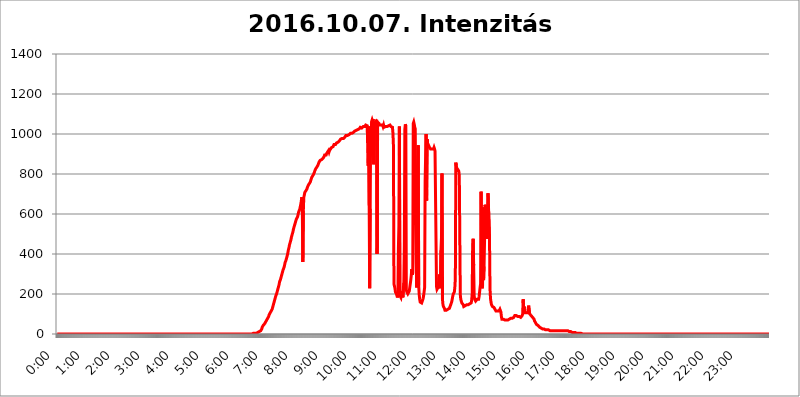
| Category | 2016.10.07. Intenzitás [W/m^2] |
|---|---|
| 0.0 | 0 |
| 0.0006944444444444445 | 0 |
| 0.001388888888888889 | 0 |
| 0.0020833333333333333 | 0 |
| 0.002777777777777778 | 0 |
| 0.003472222222222222 | 0 |
| 0.004166666666666667 | 0 |
| 0.004861111111111111 | 0 |
| 0.005555555555555556 | 0 |
| 0.0062499999999999995 | 0 |
| 0.006944444444444444 | 0 |
| 0.007638888888888889 | 0 |
| 0.008333333333333333 | 0 |
| 0.009027777777777779 | 0 |
| 0.009722222222222222 | 0 |
| 0.010416666666666666 | 0 |
| 0.011111111111111112 | 0 |
| 0.011805555555555555 | 0 |
| 0.012499999999999999 | 0 |
| 0.013194444444444444 | 0 |
| 0.013888888888888888 | 0 |
| 0.014583333333333332 | 0 |
| 0.015277777777777777 | 0 |
| 0.015972222222222224 | 0 |
| 0.016666666666666666 | 0 |
| 0.017361111111111112 | 0 |
| 0.018055555555555557 | 0 |
| 0.01875 | 0 |
| 0.019444444444444445 | 0 |
| 0.02013888888888889 | 0 |
| 0.020833333333333332 | 0 |
| 0.02152777777777778 | 0 |
| 0.022222222222222223 | 0 |
| 0.02291666666666667 | 0 |
| 0.02361111111111111 | 0 |
| 0.024305555555555556 | 0 |
| 0.024999999999999998 | 0 |
| 0.025694444444444447 | 0 |
| 0.02638888888888889 | 0 |
| 0.027083333333333334 | 0 |
| 0.027777777777777776 | 0 |
| 0.02847222222222222 | 0 |
| 0.029166666666666664 | 0 |
| 0.029861111111111113 | 0 |
| 0.030555555555555555 | 0 |
| 0.03125 | 0 |
| 0.03194444444444445 | 0 |
| 0.03263888888888889 | 0 |
| 0.03333333333333333 | 0 |
| 0.034027777777777775 | 0 |
| 0.034722222222222224 | 0 |
| 0.035416666666666666 | 0 |
| 0.036111111111111115 | 0 |
| 0.03680555555555556 | 0 |
| 0.0375 | 0 |
| 0.03819444444444444 | 0 |
| 0.03888888888888889 | 0 |
| 0.03958333333333333 | 0 |
| 0.04027777777777778 | 0 |
| 0.04097222222222222 | 0 |
| 0.041666666666666664 | 0 |
| 0.042361111111111106 | 0 |
| 0.04305555555555556 | 0 |
| 0.043750000000000004 | 0 |
| 0.044444444444444446 | 0 |
| 0.04513888888888889 | 0 |
| 0.04583333333333334 | 0 |
| 0.04652777777777778 | 0 |
| 0.04722222222222222 | 0 |
| 0.04791666666666666 | 0 |
| 0.04861111111111111 | 0 |
| 0.049305555555555554 | 0 |
| 0.049999999999999996 | 0 |
| 0.05069444444444445 | 0 |
| 0.051388888888888894 | 0 |
| 0.052083333333333336 | 0 |
| 0.05277777777777778 | 0 |
| 0.05347222222222222 | 0 |
| 0.05416666666666667 | 0 |
| 0.05486111111111111 | 0 |
| 0.05555555555555555 | 0 |
| 0.05625 | 0 |
| 0.05694444444444444 | 0 |
| 0.057638888888888885 | 0 |
| 0.05833333333333333 | 0 |
| 0.05902777777777778 | 0 |
| 0.059722222222222225 | 0 |
| 0.06041666666666667 | 0 |
| 0.061111111111111116 | 0 |
| 0.06180555555555556 | 0 |
| 0.0625 | 0 |
| 0.06319444444444444 | 0 |
| 0.06388888888888888 | 0 |
| 0.06458333333333334 | 0 |
| 0.06527777777777778 | 0 |
| 0.06597222222222222 | 0 |
| 0.06666666666666667 | 0 |
| 0.06736111111111111 | 0 |
| 0.06805555555555555 | 0 |
| 0.06874999999999999 | 0 |
| 0.06944444444444443 | 0 |
| 0.07013888888888889 | 0 |
| 0.07083333333333333 | 0 |
| 0.07152777777777779 | 0 |
| 0.07222222222222223 | 0 |
| 0.07291666666666667 | 0 |
| 0.07361111111111111 | 0 |
| 0.07430555555555556 | 0 |
| 0.075 | 0 |
| 0.07569444444444444 | 0 |
| 0.0763888888888889 | 0 |
| 0.07708333333333334 | 0 |
| 0.07777777777777778 | 0 |
| 0.07847222222222222 | 0 |
| 0.07916666666666666 | 0 |
| 0.0798611111111111 | 0 |
| 0.08055555555555556 | 0 |
| 0.08125 | 0 |
| 0.08194444444444444 | 0 |
| 0.08263888888888889 | 0 |
| 0.08333333333333333 | 0 |
| 0.08402777777777777 | 0 |
| 0.08472222222222221 | 0 |
| 0.08541666666666665 | 0 |
| 0.08611111111111112 | 0 |
| 0.08680555555555557 | 0 |
| 0.08750000000000001 | 0 |
| 0.08819444444444445 | 0 |
| 0.08888888888888889 | 0 |
| 0.08958333333333333 | 0 |
| 0.09027777777777778 | 0 |
| 0.09097222222222222 | 0 |
| 0.09166666666666667 | 0 |
| 0.09236111111111112 | 0 |
| 0.09305555555555556 | 0 |
| 0.09375 | 0 |
| 0.09444444444444444 | 0 |
| 0.09513888888888888 | 0 |
| 0.09583333333333333 | 0 |
| 0.09652777777777777 | 0 |
| 0.09722222222222222 | 0 |
| 0.09791666666666667 | 0 |
| 0.09861111111111111 | 0 |
| 0.09930555555555555 | 0 |
| 0.09999999999999999 | 0 |
| 0.10069444444444443 | 0 |
| 0.1013888888888889 | 0 |
| 0.10208333333333335 | 0 |
| 0.10277777777777779 | 0 |
| 0.10347222222222223 | 0 |
| 0.10416666666666667 | 0 |
| 0.10486111111111111 | 0 |
| 0.10555555555555556 | 0 |
| 0.10625 | 0 |
| 0.10694444444444444 | 0 |
| 0.1076388888888889 | 0 |
| 0.10833333333333334 | 0 |
| 0.10902777777777778 | 0 |
| 0.10972222222222222 | 0 |
| 0.1111111111111111 | 0 |
| 0.11180555555555556 | 0 |
| 0.11180555555555556 | 0 |
| 0.1125 | 0 |
| 0.11319444444444444 | 0 |
| 0.11388888888888889 | 0 |
| 0.11458333333333333 | 0 |
| 0.11527777777777777 | 0 |
| 0.11597222222222221 | 0 |
| 0.11666666666666665 | 0 |
| 0.1173611111111111 | 0 |
| 0.11805555555555557 | 0 |
| 0.11944444444444445 | 0 |
| 0.12013888888888889 | 0 |
| 0.12083333333333333 | 0 |
| 0.12152777777777778 | 0 |
| 0.12222222222222223 | 0 |
| 0.12291666666666667 | 0 |
| 0.12291666666666667 | 0 |
| 0.12361111111111112 | 0 |
| 0.12430555555555556 | 0 |
| 0.125 | 0 |
| 0.12569444444444444 | 0 |
| 0.12638888888888888 | 0 |
| 0.12708333333333333 | 0 |
| 0.16875 | 0 |
| 0.12847222222222224 | 0 |
| 0.12916666666666668 | 0 |
| 0.12986111111111112 | 0 |
| 0.13055555555555556 | 0 |
| 0.13125 | 0 |
| 0.13194444444444445 | 0 |
| 0.1326388888888889 | 0 |
| 0.13333333333333333 | 0 |
| 0.13402777777777777 | 0 |
| 0.13402777777777777 | 0 |
| 0.13472222222222222 | 0 |
| 0.13541666666666666 | 0 |
| 0.1361111111111111 | 0 |
| 0.13749999999999998 | 0 |
| 0.13819444444444443 | 0 |
| 0.1388888888888889 | 0 |
| 0.13958333333333334 | 0 |
| 0.14027777777777778 | 0 |
| 0.14097222222222222 | 0 |
| 0.14166666666666666 | 0 |
| 0.1423611111111111 | 0 |
| 0.14305555555555557 | 0 |
| 0.14375000000000002 | 0 |
| 0.14444444444444446 | 0 |
| 0.1451388888888889 | 0 |
| 0.1451388888888889 | 0 |
| 0.14652777777777778 | 0 |
| 0.14722222222222223 | 0 |
| 0.14791666666666667 | 0 |
| 0.1486111111111111 | 0 |
| 0.14930555555555555 | 0 |
| 0.15 | 0 |
| 0.15069444444444444 | 0 |
| 0.15138888888888888 | 0 |
| 0.15208333333333332 | 0 |
| 0.15277777777777776 | 0 |
| 0.15347222222222223 | 0 |
| 0.15416666666666667 | 0 |
| 0.15486111111111112 | 0 |
| 0.15555555555555556 | 0 |
| 0.15625 | 0 |
| 0.15694444444444444 | 0 |
| 0.15763888888888888 | 0 |
| 0.15833333333333333 | 0 |
| 0.15902777777777777 | 0 |
| 0.15972222222222224 | 0 |
| 0.16041666666666668 | 0 |
| 0.16111111111111112 | 0 |
| 0.16180555555555556 | 0 |
| 0.1625 | 0 |
| 0.16319444444444445 | 0 |
| 0.1638888888888889 | 0 |
| 0.16458333333333333 | 0 |
| 0.16527777777777777 | 0 |
| 0.16597222222222222 | 0 |
| 0.16666666666666666 | 0 |
| 0.1673611111111111 | 0 |
| 0.16805555555555554 | 0 |
| 0.16874999999999998 | 0 |
| 0.16944444444444443 | 0 |
| 0.17013888888888887 | 0 |
| 0.1708333333333333 | 0 |
| 0.17152777777777775 | 0 |
| 0.17222222222222225 | 0 |
| 0.1729166666666667 | 0 |
| 0.17361111111111113 | 0 |
| 0.17430555555555557 | 0 |
| 0.17500000000000002 | 0 |
| 0.17569444444444446 | 0 |
| 0.1763888888888889 | 0 |
| 0.17708333333333334 | 0 |
| 0.17777777777777778 | 0 |
| 0.17847222222222223 | 0 |
| 0.17916666666666667 | 0 |
| 0.1798611111111111 | 0 |
| 0.18055555555555555 | 0 |
| 0.18125 | 0 |
| 0.18194444444444444 | 0 |
| 0.1826388888888889 | 0 |
| 0.18333333333333335 | 0 |
| 0.1840277777777778 | 0 |
| 0.18472222222222223 | 0 |
| 0.18541666666666667 | 0 |
| 0.18611111111111112 | 0 |
| 0.18680555555555556 | 0 |
| 0.1875 | 0 |
| 0.18819444444444444 | 0 |
| 0.18888888888888888 | 0 |
| 0.18958333333333333 | 0 |
| 0.19027777777777777 | 0 |
| 0.1909722222222222 | 0 |
| 0.19166666666666665 | 0 |
| 0.19236111111111112 | 0 |
| 0.19305555555555554 | 0 |
| 0.19375 | 0 |
| 0.19444444444444445 | 0 |
| 0.1951388888888889 | 0 |
| 0.19583333333333333 | 0 |
| 0.19652777777777777 | 0 |
| 0.19722222222222222 | 0 |
| 0.19791666666666666 | 0 |
| 0.1986111111111111 | 0 |
| 0.19930555555555554 | 0 |
| 0.19999999999999998 | 0 |
| 0.20069444444444443 | 0 |
| 0.20138888888888887 | 0 |
| 0.2020833333333333 | 0 |
| 0.2027777777777778 | 0 |
| 0.2034722222222222 | 0 |
| 0.2041666666666667 | 0 |
| 0.20486111111111113 | 0 |
| 0.20555555555555557 | 0 |
| 0.20625000000000002 | 0 |
| 0.20694444444444446 | 0 |
| 0.2076388888888889 | 0 |
| 0.20833333333333334 | 0 |
| 0.20902777777777778 | 0 |
| 0.20972222222222223 | 0 |
| 0.21041666666666667 | 0 |
| 0.2111111111111111 | 0 |
| 0.21180555555555555 | 0 |
| 0.2125 | 0 |
| 0.21319444444444444 | 0 |
| 0.2138888888888889 | 0 |
| 0.21458333333333335 | 0 |
| 0.2152777777777778 | 0 |
| 0.21597222222222223 | 0 |
| 0.21666666666666667 | 0 |
| 0.21736111111111112 | 0 |
| 0.21805555555555556 | 0 |
| 0.21875 | 0 |
| 0.21944444444444444 | 0 |
| 0.22013888888888888 | 0 |
| 0.22083333333333333 | 0 |
| 0.22152777777777777 | 0 |
| 0.2222222222222222 | 0 |
| 0.22291666666666665 | 0 |
| 0.2236111111111111 | 0 |
| 0.22430555555555556 | 0 |
| 0.225 | 0 |
| 0.22569444444444445 | 0 |
| 0.2263888888888889 | 0 |
| 0.22708333333333333 | 0 |
| 0.22777777777777777 | 0 |
| 0.22847222222222222 | 0 |
| 0.22916666666666666 | 0 |
| 0.2298611111111111 | 0 |
| 0.23055555555555554 | 0 |
| 0.23124999999999998 | 0 |
| 0.23194444444444443 | 0 |
| 0.23263888888888887 | 0 |
| 0.2333333333333333 | 0 |
| 0.2340277777777778 | 0 |
| 0.2347222222222222 | 0 |
| 0.2354166666666667 | 0 |
| 0.23611111111111113 | 0 |
| 0.23680555555555557 | 0 |
| 0.23750000000000002 | 0 |
| 0.23819444444444446 | 0 |
| 0.2388888888888889 | 0 |
| 0.23958333333333334 | 0 |
| 0.24027777777777778 | 0 |
| 0.24097222222222223 | 0 |
| 0.24166666666666667 | 0 |
| 0.2423611111111111 | 0 |
| 0.24305555555555555 | 0 |
| 0.24375 | 0 |
| 0.24444444444444446 | 0 |
| 0.24513888888888888 | 0 |
| 0.24583333333333335 | 0 |
| 0.2465277777777778 | 0 |
| 0.24722222222222223 | 0 |
| 0.24791666666666667 | 0 |
| 0.24861111111111112 | 0 |
| 0.24930555555555556 | 0 |
| 0.25 | 0 |
| 0.25069444444444444 | 0 |
| 0.2513888888888889 | 0 |
| 0.2520833333333333 | 0 |
| 0.25277777777777777 | 0 |
| 0.2534722222222222 | 0 |
| 0.25416666666666665 | 0 |
| 0.2548611111111111 | 0 |
| 0.2555555555555556 | 0 |
| 0.25625000000000003 | 0 |
| 0.2569444444444445 | 0 |
| 0.2576388888888889 | 0 |
| 0.25833333333333336 | 0 |
| 0.2590277777777778 | 0 |
| 0.25972222222222224 | 0 |
| 0.2604166666666667 | 0 |
| 0.2611111111111111 | 0 |
| 0.26180555555555557 | 0 |
| 0.2625 | 0 |
| 0.26319444444444445 | 0 |
| 0.2638888888888889 | 0 |
| 0.26458333333333334 | 0 |
| 0.2652777777777778 | 0 |
| 0.2659722222222222 | 0 |
| 0.26666666666666666 | 0 |
| 0.2673611111111111 | 0 |
| 0.26805555555555555 | 0 |
| 0.26875 | 0 |
| 0.26944444444444443 | 0 |
| 0.2701388888888889 | 0 |
| 0.2708333333333333 | 0 |
| 0.27152777777777776 | 0 |
| 0.2722222222222222 | 0 |
| 0.27291666666666664 | 0 |
| 0.2736111111111111 | 0 |
| 0.2743055555555555 | 3.525 |
| 0.27499999999999997 | 3.525 |
| 0.27569444444444446 | 3.525 |
| 0.27638888888888885 | 3.525 |
| 0.27708333333333335 | 3.525 |
| 0.2777777777777778 | 3.525 |
| 0.27847222222222223 | 3.525 |
| 0.2791666666666667 | 3.525 |
| 0.2798611111111111 | 3.525 |
| 0.28055555555555556 | 7.887 |
| 0.28125 | 7.887 |
| 0.28194444444444444 | 7.887 |
| 0.2826388888888889 | 7.887 |
| 0.2833333333333333 | 12.257 |
| 0.28402777777777777 | 12.257 |
| 0.2847222222222222 | 12.257 |
| 0.28541666666666665 | 16.636 |
| 0.28611111111111115 | 21.024 |
| 0.28680555555555554 | 25.419 |
| 0.28750000000000003 | 34.234 |
| 0.2881944444444445 | 38.653 |
| 0.2888888888888889 | 43.079 |
| 0.28958333333333336 | 47.511 |
| 0.2902777777777778 | 47.511 |
| 0.29097222222222224 | 51.951 |
| 0.2916666666666667 | 56.398 |
| 0.2923611111111111 | 60.85 |
| 0.29305555555555557 | 65.31 |
| 0.29375 | 69.775 |
| 0.29444444444444445 | 74.246 |
| 0.2951388888888889 | 78.722 |
| 0.29583333333333334 | 83.205 |
| 0.2965277777777778 | 87.692 |
| 0.2972222222222222 | 96.682 |
| 0.29791666666666666 | 101.184 |
| 0.2986111111111111 | 105.69 |
| 0.29930555555555555 | 110.201 |
| 0.3 | 114.716 |
| 0.30069444444444443 | 119.235 |
| 0.3013888888888889 | 123.758 |
| 0.3020833333333333 | 132.814 |
| 0.30277777777777776 | 141.884 |
| 0.3034722222222222 | 146.423 |
| 0.30416666666666664 | 160.056 |
| 0.3048611111111111 | 169.156 |
| 0.3055555555555555 | 178.264 |
| 0.30624999999999997 | 187.378 |
| 0.3069444444444444 | 191.937 |
| 0.3076388888888889 | 201.058 |
| 0.30833333333333335 | 210.182 |
| 0.3090277777777778 | 219.309 |
| 0.30972222222222223 | 228.436 |
| 0.3104166666666667 | 237.564 |
| 0.3111111111111111 | 246.689 |
| 0.31180555555555556 | 260.373 |
| 0.3125 | 264.932 |
| 0.31319444444444444 | 274.047 |
| 0.3138888888888889 | 283.156 |
| 0.3145833333333333 | 287.709 |
| 0.31527777777777777 | 301.354 |
| 0.3159722222222222 | 310.44 |
| 0.31666666666666665 | 319.517 |
| 0.31736111111111115 | 324.052 |
| 0.31805555555555554 | 333.113 |
| 0.31875000000000003 | 342.162 |
| 0.3194444444444445 | 355.712 |
| 0.3201388888888889 | 360.221 |
| 0.32083333333333336 | 369.23 |
| 0.3215277777777778 | 378.224 |
| 0.32222222222222224 | 387.202 |
| 0.3229166666666667 | 396.164 |
| 0.3236111111111111 | 409.574 |
| 0.32430555555555557 | 422.943 |
| 0.325 | 431.833 |
| 0.32569444444444445 | 445.129 |
| 0.3263888888888889 | 453.968 |
| 0.32708333333333334 | 458.38 |
| 0.3277777777777778 | 471.582 |
| 0.3284722222222222 | 484.735 |
| 0.32916666666666666 | 493.475 |
| 0.3298611111111111 | 502.192 |
| 0.33055555555555555 | 510.885 |
| 0.33125 | 523.88 |
| 0.33194444444444443 | 532.513 |
| 0.3326388888888889 | 541.121 |
| 0.3333333333333333 | 549.704 |
| 0.3340277777777778 | 553.986 |
| 0.3347222222222222 | 566.793 |
| 0.3354166666666667 | 575.299 |
| 0.3361111111111111 | 579.542 |
| 0.3368055555555556 | 583.779 |
| 0.33749999999999997 | 592.233 |
| 0.33819444444444446 | 604.864 |
| 0.33888888888888885 | 613.252 |
| 0.33958333333333335 | 617.436 |
| 0.34027777777777773 | 625.784 |
| 0.34097222222222223 | 638.256 |
| 0.3416666666666666 | 650.667 |
| 0.3423611111111111 | 667.123 |
| 0.3430555555555555 | 683.473 |
| 0.34375 | 609.062 |
| 0.3444444444444445 | 360.221 |
| 0.3451388888888889 | 617.436 |
| 0.3458333333333334 | 683.473 |
| 0.34652777777777777 | 695.666 |
| 0.34722222222222227 | 707.8 |
| 0.34791666666666665 | 711.832 |
| 0.34861111111111115 | 715.858 |
| 0.34930555555555554 | 719.877 |
| 0.35000000000000003 | 723.889 |
| 0.3506944444444444 | 731.896 |
| 0.3513888888888889 | 731.896 |
| 0.3520833333333333 | 743.859 |
| 0.3527777777777778 | 747.834 |
| 0.3534722222222222 | 751.803 |
| 0.3541666666666667 | 755.766 |
| 0.3548611111111111 | 759.723 |
| 0.35555555555555557 | 767.62 |
| 0.35625 | 771.559 |
| 0.35694444444444445 | 783.342 |
| 0.3576388888888889 | 783.342 |
| 0.35833333333333334 | 787.258 |
| 0.3590277777777778 | 795.074 |
| 0.3597222222222222 | 798.974 |
| 0.36041666666666666 | 806.757 |
| 0.3611111111111111 | 814.519 |
| 0.36180555555555555 | 818.392 |
| 0.3625 | 826.123 |
| 0.36319444444444443 | 826.123 |
| 0.3638888888888889 | 833.834 |
| 0.3645833333333333 | 837.682 |
| 0.3652777777777778 | 841.526 |
| 0.3659722222222222 | 841.526 |
| 0.3666666666666667 | 845.365 |
| 0.3673611111111111 | 860.676 |
| 0.3680555555555556 | 860.676 |
| 0.36874999999999997 | 868.305 |
| 0.36944444444444446 | 872.114 |
| 0.37013888888888885 | 868.305 |
| 0.37083333333333335 | 872.114 |
| 0.37152777777777773 | 872.114 |
| 0.37222222222222223 | 875.918 |
| 0.3729166666666666 | 879.719 |
| 0.3736111111111111 | 883.516 |
| 0.3743055555555555 | 887.309 |
| 0.375 | 894.885 |
| 0.3756944444444445 | 894.885 |
| 0.3763888888888889 | 894.885 |
| 0.3770833333333334 | 894.885 |
| 0.37777777777777777 | 902.447 |
| 0.37847222222222227 | 906.223 |
| 0.37916666666666665 | 909.996 |
| 0.37986111111111115 | 909.996 |
| 0.38055555555555554 | 917.534 |
| 0.38125000000000003 | 909.996 |
| 0.3819444444444444 | 917.534 |
| 0.3826388888888889 | 921.298 |
| 0.3833333333333333 | 925.06 |
| 0.3840277777777778 | 925.06 |
| 0.3847222222222222 | 932.576 |
| 0.3854166666666667 | 928.819 |
| 0.3861111111111111 | 936.33 |
| 0.38680555555555557 | 936.33 |
| 0.3875 | 940.082 |
| 0.38819444444444445 | 947.58 |
| 0.3888888888888889 | 947.58 |
| 0.38958333333333334 | 947.58 |
| 0.3902777777777778 | 947.58 |
| 0.3909722222222222 | 951.327 |
| 0.39166666666666666 | 955.071 |
| 0.3923611111111111 | 955.071 |
| 0.39305555555555555 | 955.071 |
| 0.39375 | 958.814 |
| 0.39444444444444443 | 962.555 |
| 0.3951388888888889 | 962.555 |
| 0.3958333333333333 | 966.295 |
| 0.3965277777777778 | 970.034 |
| 0.3972222222222222 | 973.772 |
| 0.3979166666666667 | 977.508 |
| 0.3986111111111111 | 977.508 |
| 0.3993055555555556 | 977.508 |
| 0.39999999999999997 | 977.508 |
| 0.40069444444444446 | 977.508 |
| 0.40138888888888885 | 977.508 |
| 0.40208333333333335 | 981.244 |
| 0.40277777777777773 | 981.244 |
| 0.40347222222222223 | 984.98 |
| 0.4041666666666666 | 984.98 |
| 0.4048611111111111 | 992.448 |
| 0.4055555555555555 | 992.448 |
| 0.40625 | 996.182 |
| 0.4069444444444445 | 992.448 |
| 0.4076388888888889 | 992.448 |
| 0.4083333333333334 | 992.448 |
| 0.40902777777777777 | 996.182 |
| 0.40972222222222227 | 999.916 |
| 0.41041666666666665 | 999.916 |
| 0.41111111111111115 | 1003.65 |
| 0.41180555555555554 | 1003.65 |
| 0.41250000000000003 | 1007.383 |
| 0.4131944444444444 | 1003.65 |
| 0.4138888888888889 | 999.916 |
| 0.4145833333333333 | 1003.65 |
| 0.4152777777777778 | 1007.383 |
| 0.4159722222222222 | 1011.118 |
| 0.4166666666666667 | 1011.118 |
| 0.4173611111111111 | 1014.852 |
| 0.41805555555555557 | 1018.587 |
| 0.41875 | 1018.587 |
| 0.41944444444444445 | 1018.587 |
| 0.4201388888888889 | 1018.587 |
| 0.42083333333333334 | 1022.323 |
| 0.4215277777777778 | 1022.323 |
| 0.4222222222222222 | 1022.323 |
| 0.42291666666666666 | 1026.06 |
| 0.4236111111111111 | 1026.06 |
| 0.42430555555555555 | 1029.798 |
| 0.425 | 1033.537 |
| 0.42569444444444443 | 1029.798 |
| 0.4263888888888889 | 1033.537 |
| 0.4270833333333333 | 1029.798 |
| 0.4277777777777778 | 1026.06 |
| 0.4284722222222222 | 1033.537 |
| 0.4291666666666667 | 1037.277 |
| 0.4298611111111111 | 1037.277 |
| 0.4305555555555556 | 1037.277 |
| 0.43124999999999997 | 1037.277 |
| 0.43194444444444446 | 1037.277 |
| 0.43263888888888885 | 1044.762 |
| 0.43333333333333335 | 1044.762 |
| 0.43402777777777773 | 1048.508 |
| 0.43472222222222223 | 1041.019 |
| 0.4354166666666666 | 1037.277 |
| 0.4361111111111111 | 841.526 |
| 0.4368055555555555 | 1037.277 |
| 0.4375 | 642.4 |
| 0.4381944444444445 | 228.436 |
| 0.4388888888888889 | 625.784 |
| 0.4395833333333334 | 1029.798 |
| 0.44027777777777777 | 898.668 |
| 0.44097222222222227 | 1063.51 |
| 0.44166666666666665 | 1071.027 |
| 0.44236111111111115 | 1063.51 |
| 0.44305555555555554 | 1074.789 |
| 0.44375000000000003 | 849.199 |
| 0.4444444444444444 | 1037.277 |
| 0.4451388888888889 | 1056.004 |
| 0.4458333333333333 | 1056.004 |
| 0.4465277777777778 | 1056.004 |
| 0.4472222222222222 | 1059.756 |
| 0.4479166666666667 | 1071.027 |
| 0.4486111111111111 | 400.638 |
| 0.44930555555555557 | 1059.756 |
| 0.45 | 1056.004 |
| 0.45069444444444445 | 1056.004 |
| 0.4513888888888889 | 1052.255 |
| 0.45208333333333334 | 1044.762 |
| 0.4527777777777778 | 1048.508 |
| 0.4534722222222222 | 1044.762 |
| 0.45416666666666666 | 1044.762 |
| 0.4548611111111111 | 1041.019 |
| 0.45555555555555555 | 1044.762 |
| 0.45625 | 1044.762 |
| 0.45694444444444443 | 1037.277 |
| 0.4576388888888889 | 1044.762 |
| 0.4583333333333333 | 1033.537 |
| 0.4590277777777778 | 1029.798 |
| 0.4597222222222222 | 1037.277 |
| 0.4604166666666667 | 1037.277 |
| 0.4611111111111111 | 1037.277 |
| 0.4618055555555556 | 1037.277 |
| 0.46249999999999997 | 1037.277 |
| 0.46319444444444446 | 1037.277 |
| 0.46388888888888885 | 1041.019 |
| 0.46458333333333335 | 1041.019 |
| 0.46527777777777773 | 1044.762 |
| 0.46597222222222223 | 1044.762 |
| 0.4666666666666666 | 1044.762 |
| 0.4673611111111111 | 1044.762 |
| 0.4680555555555555 | 1037.277 |
| 0.46875 | 1037.277 |
| 0.4694444444444445 | 1037.277 |
| 0.4701388888888889 | 1033.537 |
| 0.4708333333333334 | 1003.65 |
| 0.47152777777777777 | 940.082 |
| 0.47222222222222227 | 251.251 |
| 0.47291666666666665 | 251.251 |
| 0.47361111111111115 | 228.436 |
| 0.47430555555555554 | 210.182 |
| 0.47500000000000003 | 205.62 |
| 0.4756944444444444 | 201.058 |
| 0.4763888888888889 | 191.937 |
| 0.4770833333333333 | 182.82 |
| 0.4777777777777778 | 196.497 |
| 0.4784722222222222 | 427.39 |
| 0.4791666666666667 | 541.121 |
| 0.4798611111111111 | 1037.277 |
| 0.48055555555555557 | 191.937 |
| 0.48125 | 196.497 |
| 0.48194444444444445 | 182.82 |
| 0.4826388888888889 | 201.058 |
| 0.48333333333333334 | 214.746 |
| 0.4840277777777778 | 205.62 |
| 0.4847222222222222 | 182.82 |
| 0.48541666666666666 | 182.82 |
| 0.4861111111111111 | 255.813 |
| 0.48680555555555555 | 445.129 |
| 0.4875 | 1022.323 |
| 0.48819444444444443 | 1048.508 |
| 0.4888888888888889 | 1041.019 |
| 0.4895833333333333 | 219.309 |
| 0.4902777777777778 | 210.182 |
| 0.4909722222222222 | 214.746 |
| 0.4916666666666667 | 201.058 |
| 0.4923611111111111 | 201.058 |
| 0.4930555555555556 | 205.62 |
| 0.49374999999999997 | 214.746 |
| 0.49444444444444446 | 233 |
| 0.49513888888888885 | 251.251 |
| 0.49583333333333335 | 269.49 |
| 0.49652777777777773 | 292.259 |
| 0.49722222222222223 | 324.052 |
| 0.4979166666666666 | 296.808 |
| 0.4986111111111111 | 305.898 |
| 0.4993055555555555 | 1052.255 |
| 0.5 | 1059.756 |
| 0.5006944444444444 | 1048.508 |
| 0.5013888888888889 | 1033.537 |
| 0.5020833333333333 | 1026.06 |
| 0.5027777777777778 | 1022.323 |
| 0.5034722222222222 | 355.712 |
| 0.5041666666666667 | 233 |
| 0.5048611111111111 | 237.564 |
| 0.5055555555555555 | 707.8 |
| 0.50625 | 943.832 |
| 0.5069444444444444 | 242.127 |
| 0.5076388888888889 | 196.497 |
| 0.5083333333333333 | 173.709 |
| 0.5090277777777777 | 160.056 |
| 0.5097222222222222 | 155.509 |
| 0.5104166666666666 | 155.509 |
| 0.5111111111111112 | 155.509 |
| 0.5118055555555555 | 160.056 |
| 0.5125000000000001 | 169.156 |
| 0.5131944444444444 | 178.264 |
| 0.513888888888889 | 191.937 |
| 0.5145833333333333 | 196.497 |
| 0.5152777777777778 | 233 |
| 0.5159722222222222 | 763.674 |
| 0.5166666666666667 | 891.099 |
| 0.517361111111111 | 999.916 |
| 0.5180555555555556 | 667.123 |
| 0.5187499999999999 | 973.772 |
| 0.5194444444444445 | 955.071 |
| 0.5201388888888888 | 951.327 |
| 0.5208333333333334 | 943.832 |
| 0.5215277777777778 | 940.082 |
| 0.5222222222222223 | 932.576 |
| 0.5229166666666667 | 932.576 |
| 0.5236111111111111 | 925.06 |
| 0.5243055555555556 | 925.06 |
| 0.525 | 928.819 |
| 0.5256944444444445 | 925.06 |
| 0.5263888888888889 | 928.819 |
| 0.5270833333333333 | 925.06 |
| 0.5277777777777778 | 925.06 |
| 0.5284722222222222 | 932.576 |
| 0.5291666666666667 | 925.06 |
| 0.5298611111111111 | 913.766 |
| 0.5305555555555556 | 917.534 |
| 0.53125 | 917.534 |
| 0.5319444444444444 | 237.564 |
| 0.5326388888888889 | 223.873 |
| 0.5333333333333333 | 228.436 |
| 0.5340277777777778 | 233 |
| 0.5347222222222222 | 242.127 |
| 0.5354166666666667 | 233 |
| 0.5361111111111111 | 296.808 |
| 0.5368055555555555 | 246.689 |
| 0.5375 | 228.436 |
| 0.5381944444444444 | 418.492 |
| 0.5388888888888889 | 480.356 |
| 0.5395833333333333 | 802.868 |
| 0.5402777777777777 | 173.709 |
| 0.5409722222222222 | 146.423 |
| 0.5416666666666666 | 137.347 |
| 0.5423611111111112 | 132.814 |
| 0.5430555555555555 | 128.284 |
| 0.5437500000000001 | 119.235 |
| 0.5444444444444444 | 119.235 |
| 0.545138888888889 | 119.235 |
| 0.5458333333333333 | 119.235 |
| 0.5465277777777778 | 119.235 |
| 0.5472222222222222 | 119.235 |
| 0.5479166666666667 | 123.758 |
| 0.548611111111111 | 123.758 |
| 0.5493055555555556 | 128.284 |
| 0.5499999999999999 | 128.284 |
| 0.5506944444444445 | 132.814 |
| 0.5513888888888888 | 141.884 |
| 0.5520833333333334 | 146.423 |
| 0.5527777777777778 | 155.509 |
| 0.5534722222222223 | 164.605 |
| 0.5541666666666667 | 178.264 |
| 0.5548611111111111 | 191.937 |
| 0.5555555555555556 | 201.058 |
| 0.55625 | 205.62 |
| 0.5569444444444445 | 210.182 |
| 0.5576388888888889 | 233 |
| 0.5583333333333333 | 278.603 |
| 0.5590277777777778 | 856.855 |
| 0.5597222222222222 | 841.526 |
| 0.5604166666666667 | 810.641 |
| 0.5611111111111111 | 826.123 |
| 0.5618055555555556 | 826.123 |
| 0.5625 | 822.26 |
| 0.5631944444444444 | 814.519 |
| 0.5638888888888889 | 791.169 |
| 0.5645833333333333 | 791.169 |
| 0.5652777777777778 | 196.497 |
| 0.5659722222222222 | 173.709 |
| 0.5666666666666667 | 164.605 |
| 0.5673611111111111 | 155.509 |
| 0.5680555555555555 | 155.509 |
| 0.56875 | 150.964 |
| 0.5694444444444444 | 146.423 |
| 0.5701388888888889 | 137.347 |
| 0.5708333333333333 | 137.347 |
| 0.5715277777777777 | 137.347 |
| 0.5722222222222222 | 141.884 |
| 0.5729166666666666 | 146.423 |
| 0.5736111111111112 | 146.423 |
| 0.5743055555555555 | 146.423 |
| 0.5750000000000001 | 146.423 |
| 0.5756944444444444 | 150.964 |
| 0.576388888888889 | 146.423 |
| 0.5770833333333333 | 150.964 |
| 0.5777777777777778 | 146.423 |
| 0.5784722222222222 | 150.964 |
| 0.5791666666666667 | 150.964 |
| 0.579861111111111 | 150.964 |
| 0.5805555555555556 | 155.509 |
| 0.5812499999999999 | 169.156 |
| 0.5819444444444445 | 201.058 |
| 0.5826388888888888 | 436.27 |
| 0.5833333333333334 | 475.972 |
| 0.5840277777777778 | 342.162 |
| 0.5847222222222223 | 191.937 |
| 0.5854166666666667 | 173.709 |
| 0.5861111111111111 | 169.156 |
| 0.5868055555555556 | 164.605 |
| 0.5875 | 164.605 |
| 0.5881944444444445 | 169.156 |
| 0.5888888888888889 | 173.709 |
| 0.5895833333333333 | 173.709 |
| 0.5902777777777778 | 173.709 |
| 0.5909722222222222 | 173.709 |
| 0.5916666666666667 | 187.378 |
| 0.5923611111111111 | 210.182 |
| 0.5930555555555556 | 233 |
| 0.59375 | 251.251 |
| 0.5944444444444444 | 711.832 |
| 0.5951388888888889 | 287.709 |
| 0.5958333333333333 | 228.436 |
| 0.5965277777777778 | 242.127 |
| 0.5972222222222222 | 634.105 |
| 0.5979166666666667 | 269.49 |
| 0.5986111111111111 | 337.639 |
| 0.5993055555555555 | 467.187 |
| 0.6 | 646.537 |
| 0.6006944444444444 | 634.105 |
| 0.6013888888888889 | 515.223 |
| 0.6020833333333333 | 545.416 |
| 0.6027777777777777 | 475.972 |
| 0.6034722222222222 | 617.436 |
| 0.6041666666666666 | 703.762 |
| 0.6048611111111112 | 703.762 |
| 0.6055555555555555 | 703.762 |
| 0.6062500000000001 | 480.356 |
| 0.6069444444444444 | 228.436 |
| 0.607638888888889 | 178.264 |
| 0.6083333333333333 | 160.056 |
| 0.6090277777777778 | 146.423 |
| 0.6097222222222222 | 141.884 |
| 0.6104166666666667 | 137.347 |
| 0.611111111111111 | 132.814 |
| 0.6118055555555556 | 132.814 |
| 0.6124999999999999 | 132.814 |
| 0.6131944444444445 | 128.284 |
| 0.6138888888888888 | 123.758 |
| 0.6145833333333334 | 119.235 |
| 0.6152777777777778 | 114.716 |
| 0.6159722222222223 | 110.201 |
| 0.6166666666666667 | 110.201 |
| 0.6173611111111111 | 114.716 |
| 0.6180555555555556 | 119.235 |
| 0.61875 | 114.716 |
| 0.6194444444444445 | 114.716 |
| 0.6201388888888889 | 119.235 |
| 0.6208333333333333 | 123.758 |
| 0.6215277777777778 | 123.758 |
| 0.6222222222222222 | 110.201 |
| 0.6229166666666667 | 87.692 |
| 0.6236111111111111 | 74.246 |
| 0.6243055555555556 | 74.246 |
| 0.625 | 74.246 |
| 0.6256944444444444 | 74.246 |
| 0.6263888888888889 | 69.775 |
| 0.6270833333333333 | 69.775 |
| 0.6277777777777778 | 69.775 |
| 0.6284722222222222 | 69.775 |
| 0.6291666666666667 | 69.775 |
| 0.6298611111111111 | 69.775 |
| 0.6305555555555555 | 69.775 |
| 0.63125 | 69.775 |
| 0.6319444444444444 | 69.775 |
| 0.6326388888888889 | 74.246 |
| 0.6333333333333333 | 74.246 |
| 0.6340277777777777 | 74.246 |
| 0.6347222222222222 | 74.246 |
| 0.6354166666666666 | 78.722 |
| 0.6361111111111112 | 78.722 |
| 0.6368055555555555 | 78.722 |
| 0.6375000000000001 | 78.722 |
| 0.6381944444444444 | 78.722 |
| 0.638888888888889 | 78.722 |
| 0.6395833333333333 | 78.722 |
| 0.6402777777777778 | 83.205 |
| 0.6409722222222222 | 87.692 |
| 0.6416666666666667 | 92.184 |
| 0.642361111111111 | 92.184 |
| 0.6430555555555556 | 92.184 |
| 0.6437499999999999 | 92.184 |
| 0.6444444444444445 | 92.184 |
| 0.6451388888888888 | 92.184 |
| 0.6458333333333334 | 87.692 |
| 0.6465277777777778 | 87.692 |
| 0.6472222222222223 | 87.692 |
| 0.6479166666666667 | 87.692 |
| 0.6486111111111111 | 87.692 |
| 0.6493055555555556 | 87.692 |
| 0.65 | 83.205 |
| 0.6506944444444445 | 83.205 |
| 0.6513888888888889 | 87.692 |
| 0.6520833333333333 | 92.184 |
| 0.6527777777777778 | 101.184 |
| 0.6534722222222222 | 173.709 |
| 0.6541666666666667 | 128.284 |
| 0.6548611111111111 | 137.347 |
| 0.6555555555555556 | 105.69 |
| 0.65625 | 105.69 |
| 0.6569444444444444 | 101.184 |
| 0.6576388888888889 | 105.69 |
| 0.6583333333333333 | 101.184 |
| 0.6590277777777778 | 101.184 |
| 0.6597222222222222 | 105.69 |
| 0.6604166666666667 | 105.69 |
| 0.6611111111111111 | 141.884 |
| 0.6618055555555555 | 146.423 |
| 0.6625 | 101.184 |
| 0.6631944444444444 | 96.682 |
| 0.6638888888888889 | 96.682 |
| 0.6645833333333333 | 92.184 |
| 0.6652777777777777 | 92.184 |
| 0.6659722222222222 | 87.692 |
| 0.6666666666666666 | 83.205 |
| 0.6673611111111111 | 78.722 |
| 0.6680555555555556 | 78.722 |
| 0.6687500000000001 | 74.246 |
| 0.6694444444444444 | 65.31 |
| 0.6701388888888888 | 60.85 |
| 0.6708333333333334 | 56.398 |
| 0.6715277777777778 | 51.951 |
| 0.6722222222222222 | 47.511 |
| 0.6729166666666666 | 47.511 |
| 0.6736111111111112 | 43.079 |
| 0.6743055555555556 | 43.079 |
| 0.6749999999999999 | 38.653 |
| 0.6756944444444444 | 38.653 |
| 0.6763888888888889 | 34.234 |
| 0.6770833333333334 | 34.234 |
| 0.6777777777777777 | 29.823 |
| 0.6784722222222223 | 29.823 |
| 0.6791666666666667 | 29.823 |
| 0.6798611111111111 | 29.823 |
| 0.6805555555555555 | 25.419 |
| 0.68125 | 25.419 |
| 0.6819444444444445 | 25.419 |
| 0.6826388888888889 | 25.419 |
| 0.6833333333333332 | 25.419 |
| 0.6840277777777778 | 21.024 |
| 0.6847222222222222 | 21.024 |
| 0.6854166666666667 | 21.024 |
| 0.686111111111111 | 21.024 |
| 0.6868055555555556 | 21.024 |
| 0.6875 | 21.024 |
| 0.6881944444444444 | 21.024 |
| 0.688888888888889 | 21.024 |
| 0.6895833333333333 | 21.024 |
| 0.6902777777777778 | 16.636 |
| 0.6909722222222222 | 16.636 |
| 0.6916666666666668 | 16.636 |
| 0.6923611111111111 | 16.636 |
| 0.6930555555555555 | 16.636 |
| 0.69375 | 16.636 |
| 0.6944444444444445 | 16.636 |
| 0.6951388888888889 | 16.636 |
| 0.6958333333333333 | 16.636 |
| 0.6965277777777777 | 16.636 |
| 0.6972222222222223 | 16.636 |
| 0.6979166666666666 | 16.636 |
| 0.6986111111111111 | 16.636 |
| 0.6993055555555556 | 16.636 |
| 0.7000000000000001 | 16.636 |
| 0.7006944444444444 | 16.636 |
| 0.7013888888888888 | 16.636 |
| 0.7020833333333334 | 16.636 |
| 0.7027777777777778 | 16.636 |
| 0.7034722222222222 | 16.636 |
| 0.7041666666666666 | 16.636 |
| 0.7048611111111112 | 16.636 |
| 0.7055555555555556 | 16.636 |
| 0.7062499999999999 | 16.636 |
| 0.7069444444444444 | 16.636 |
| 0.7076388888888889 | 16.636 |
| 0.7083333333333334 | 16.636 |
| 0.7090277777777777 | 16.636 |
| 0.7097222222222223 | 16.636 |
| 0.7104166666666667 | 16.636 |
| 0.7111111111111111 | 16.636 |
| 0.7118055555555555 | 16.636 |
| 0.7125 | 12.257 |
| 0.7131944444444445 | 12.257 |
| 0.7138888888888889 | 16.636 |
| 0.7145833333333332 | 16.636 |
| 0.7152777777777778 | 16.636 |
| 0.7159722222222222 | 16.636 |
| 0.7166666666666667 | 12.257 |
| 0.717361111111111 | 12.257 |
| 0.7180555555555556 | 12.257 |
| 0.71875 | 12.257 |
| 0.7194444444444444 | 12.257 |
| 0.720138888888889 | 12.257 |
| 0.7208333333333333 | 12.257 |
| 0.7215277777777778 | 12.257 |
| 0.7222222222222222 | 7.887 |
| 0.7229166666666668 | 7.887 |
| 0.7236111111111111 | 7.887 |
| 0.7243055555555555 | 7.887 |
| 0.725 | 7.887 |
| 0.7256944444444445 | 7.887 |
| 0.7263888888888889 | 7.887 |
| 0.7270833333333333 | 7.887 |
| 0.7277777777777777 | 7.887 |
| 0.7284722222222223 | 3.525 |
| 0.7291666666666666 | 3.525 |
| 0.7298611111111111 | 3.525 |
| 0.7305555555555556 | 3.525 |
| 0.7312500000000001 | 3.525 |
| 0.7319444444444444 | 3.525 |
| 0.7326388888888888 | 3.525 |
| 0.7333333333333334 | 3.525 |
| 0.7340277777777778 | 3.525 |
| 0.7347222222222222 | 3.525 |
| 0.7354166666666666 | 3.525 |
| 0.7361111111111112 | 3.525 |
| 0.7368055555555556 | 0 |
| 0.7374999999999999 | 0 |
| 0.7381944444444444 | 0 |
| 0.7388888888888889 | 0 |
| 0.7395833333333334 | 0 |
| 0.7402777777777777 | 0 |
| 0.7409722222222223 | 0 |
| 0.7416666666666667 | 0 |
| 0.7423611111111111 | 0 |
| 0.7430555555555555 | 0 |
| 0.74375 | 0 |
| 0.7444444444444445 | 0 |
| 0.7451388888888889 | 0 |
| 0.7458333333333332 | 0 |
| 0.7465277777777778 | 0 |
| 0.7472222222222222 | 0 |
| 0.7479166666666667 | 0 |
| 0.748611111111111 | 0 |
| 0.7493055555555556 | 0 |
| 0.75 | 0 |
| 0.7506944444444444 | 0 |
| 0.751388888888889 | 0 |
| 0.7520833333333333 | 0 |
| 0.7527777777777778 | 0 |
| 0.7534722222222222 | 0 |
| 0.7541666666666668 | 0 |
| 0.7548611111111111 | 0 |
| 0.7555555555555555 | 0 |
| 0.75625 | 0 |
| 0.7569444444444445 | 0 |
| 0.7576388888888889 | 0 |
| 0.7583333333333333 | 0 |
| 0.7590277777777777 | 0 |
| 0.7597222222222223 | 0 |
| 0.7604166666666666 | 0 |
| 0.7611111111111111 | 0 |
| 0.7618055555555556 | 0 |
| 0.7625000000000001 | 0 |
| 0.7631944444444444 | 0 |
| 0.7638888888888888 | 0 |
| 0.7645833333333334 | 0 |
| 0.7652777777777778 | 0 |
| 0.7659722222222222 | 0 |
| 0.7666666666666666 | 0 |
| 0.7673611111111112 | 0 |
| 0.7680555555555556 | 0 |
| 0.7687499999999999 | 0 |
| 0.7694444444444444 | 0 |
| 0.7701388888888889 | 0 |
| 0.7708333333333334 | 0 |
| 0.7715277777777777 | 0 |
| 0.7722222222222223 | 0 |
| 0.7729166666666667 | 0 |
| 0.7736111111111111 | 0 |
| 0.7743055555555555 | 0 |
| 0.775 | 0 |
| 0.7756944444444445 | 0 |
| 0.7763888888888889 | 0 |
| 0.7770833333333332 | 0 |
| 0.7777777777777778 | 0 |
| 0.7784722222222222 | 0 |
| 0.7791666666666667 | 0 |
| 0.779861111111111 | 0 |
| 0.7805555555555556 | 0 |
| 0.78125 | 0 |
| 0.7819444444444444 | 0 |
| 0.782638888888889 | 0 |
| 0.7833333333333333 | 0 |
| 0.7840277777777778 | 0 |
| 0.7847222222222222 | 0 |
| 0.7854166666666668 | 0 |
| 0.7861111111111111 | 0 |
| 0.7868055555555555 | 0 |
| 0.7875 | 0 |
| 0.7881944444444445 | 0 |
| 0.7888888888888889 | 0 |
| 0.7895833333333333 | 0 |
| 0.7902777777777777 | 0 |
| 0.7909722222222223 | 0 |
| 0.7916666666666666 | 0 |
| 0.7923611111111111 | 0 |
| 0.7930555555555556 | 0 |
| 0.7937500000000001 | 0 |
| 0.7944444444444444 | 0 |
| 0.7951388888888888 | 0 |
| 0.7958333333333334 | 0 |
| 0.7965277777777778 | 0 |
| 0.7972222222222222 | 0 |
| 0.7979166666666666 | 0 |
| 0.7986111111111112 | 0 |
| 0.7993055555555556 | 0 |
| 0.7999999999999999 | 0 |
| 0.8006944444444444 | 0 |
| 0.8013888888888889 | 0 |
| 0.8020833333333334 | 0 |
| 0.8027777777777777 | 0 |
| 0.8034722222222223 | 0 |
| 0.8041666666666667 | 0 |
| 0.8048611111111111 | 0 |
| 0.8055555555555555 | 0 |
| 0.80625 | 0 |
| 0.8069444444444445 | 0 |
| 0.8076388888888889 | 0 |
| 0.8083333333333332 | 0 |
| 0.8090277777777778 | 0 |
| 0.8097222222222222 | 0 |
| 0.8104166666666667 | 0 |
| 0.811111111111111 | 0 |
| 0.8118055555555556 | 0 |
| 0.8125 | 0 |
| 0.8131944444444444 | 0 |
| 0.813888888888889 | 0 |
| 0.8145833333333333 | 0 |
| 0.8152777777777778 | 0 |
| 0.8159722222222222 | 0 |
| 0.8166666666666668 | 0 |
| 0.8173611111111111 | 0 |
| 0.8180555555555555 | 0 |
| 0.81875 | 0 |
| 0.8194444444444445 | 0 |
| 0.8201388888888889 | 0 |
| 0.8208333333333333 | 0 |
| 0.8215277777777777 | 0 |
| 0.8222222222222223 | 0 |
| 0.8229166666666666 | 0 |
| 0.8236111111111111 | 0 |
| 0.8243055555555556 | 0 |
| 0.8250000000000001 | 0 |
| 0.8256944444444444 | 0 |
| 0.8263888888888888 | 0 |
| 0.8270833333333334 | 0 |
| 0.8277777777777778 | 0 |
| 0.8284722222222222 | 0 |
| 0.8291666666666666 | 0 |
| 0.8298611111111112 | 0 |
| 0.8305555555555556 | 0 |
| 0.8312499999999999 | 0 |
| 0.8319444444444444 | 0 |
| 0.8326388888888889 | 0 |
| 0.8333333333333334 | 0 |
| 0.8340277777777777 | 0 |
| 0.8347222222222223 | 0 |
| 0.8354166666666667 | 0 |
| 0.8361111111111111 | 0 |
| 0.8368055555555555 | 0 |
| 0.8375 | 0 |
| 0.8381944444444445 | 0 |
| 0.8388888888888889 | 0 |
| 0.8395833333333332 | 0 |
| 0.8402777777777778 | 0 |
| 0.8409722222222222 | 0 |
| 0.8416666666666667 | 0 |
| 0.842361111111111 | 0 |
| 0.8430555555555556 | 0 |
| 0.84375 | 0 |
| 0.8444444444444444 | 0 |
| 0.845138888888889 | 0 |
| 0.8458333333333333 | 0 |
| 0.8465277777777778 | 0 |
| 0.8472222222222222 | 0 |
| 0.8479166666666668 | 0 |
| 0.8486111111111111 | 0 |
| 0.8493055555555555 | 0 |
| 0.85 | 0 |
| 0.8506944444444445 | 0 |
| 0.8513888888888889 | 0 |
| 0.8520833333333333 | 0 |
| 0.8527777777777777 | 0 |
| 0.8534722222222223 | 0 |
| 0.8541666666666666 | 0 |
| 0.8548611111111111 | 0 |
| 0.8555555555555556 | 0 |
| 0.8562500000000001 | 0 |
| 0.8569444444444444 | 0 |
| 0.8576388888888888 | 0 |
| 0.8583333333333334 | 0 |
| 0.8590277777777778 | 0 |
| 0.8597222222222222 | 0 |
| 0.8604166666666666 | 0 |
| 0.8611111111111112 | 0 |
| 0.8618055555555556 | 0 |
| 0.8624999999999999 | 0 |
| 0.8631944444444444 | 0 |
| 0.8638888888888889 | 0 |
| 0.8645833333333334 | 0 |
| 0.8652777777777777 | 0 |
| 0.8659722222222223 | 0 |
| 0.8666666666666667 | 0 |
| 0.8673611111111111 | 0 |
| 0.8680555555555555 | 0 |
| 0.86875 | 0 |
| 0.8694444444444445 | 0 |
| 0.8701388888888889 | 0 |
| 0.8708333333333332 | 0 |
| 0.8715277777777778 | 0 |
| 0.8722222222222222 | 0 |
| 0.8729166666666667 | 0 |
| 0.873611111111111 | 0 |
| 0.8743055555555556 | 0 |
| 0.875 | 0 |
| 0.8756944444444444 | 0 |
| 0.876388888888889 | 0 |
| 0.8770833333333333 | 0 |
| 0.8777777777777778 | 0 |
| 0.8784722222222222 | 0 |
| 0.8791666666666668 | 0 |
| 0.8798611111111111 | 0 |
| 0.8805555555555555 | 0 |
| 0.88125 | 0 |
| 0.8819444444444445 | 0 |
| 0.8826388888888889 | 0 |
| 0.8833333333333333 | 0 |
| 0.8840277777777777 | 0 |
| 0.8847222222222223 | 0 |
| 0.8854166666666666 | 0 |
| 0.8861111111111111 | 0 |
| 0.8868055555555556 | 0 |
| 0.8875000000000001 | 0 |
| 0.8881944444444444 | 0 |
| 0.8888888888888888 | 0 |
| 0.8895833333333334 | 0 |
| 0.8902777777777778 | 0 |
| 0.8909722222222222 | 0 |
| 0.8916666666666666 | 0 |
| 0.8923611111111112 | 0 |
| 0.8930555555555556 | 0 |
| 0.8937499999999999 | 0 |
| 0.8944444444444444 | 0 |
| 0.8951388888888889 | 0 |
| 0.8958333333333334 | 0 |
| 0.8965277777777777 | 0 |
| 0.8972222222222223 | 0 |
| 0.8979166666666667 | 0 |
| 0.8986111111111111 | 0 |
| 0.8993055555555555 | 0 |
| 0.9 | 0 |
| 0.9006944444444445 | 0 |
| 0.9013888888888889 | 0 |
| 0.9020833333333332 | 0 |
| 0.9027777777777778 | 0 |
| 0.9034722222222222 | 0 |
| 0.9041666666666667 | 0 |
| 0.904861111111111 | 0 |
| 0.9055555555555556 | 0 |
| 0.90625 | 0 |
| 0.9069444444444444 | 0 |
| 0.907638888888889 | 0 |
| 0.9083333333333333 | 0 |
| 0.9090277777777778 | 0 |
| 0.9097222222222222 | 0 |
| 0.9104166666666668 | 0 |
| 0.9111111111111111 | 0 |
| 0.9118055555555555 | 0 |
| 0.9125 | 0 |
| 0.9131944444444445 | 0 |
| 0.9138888888888889 | 0 |
| 0.9145833333333333 | 0 |
| 0.9152777777777777 | 0 |
| 0.9159722222222223 | 0 |
| 0.9166666666666666 | 0 |
| 0.9173611111111111 | 0 |
| 0.9180555555555556 | 0 |
| 0.9187500000000001 | 0 |
| 0.9194444444444444 | 0 |
| 0.9201388888888888 | 0 |
| 0.9208333333333334 | 0 |
| 0.9215277777777778 | 0 |
| 0.9222222222222222 | 0 |
| 0.9229166666666666 | 0 |
| 0.9236111111111112 | 0 |
| 0.9243055555555556 | 0 |
| 0.9249999999999999 | 0 |
| 0.9256944444444444 | 0 |
| 0.9263888888888889 | 0 |
| 0.9270833333333334 | 0 |
| 0.9277777777777777 | 0 |
| 0.9284722222222223 | 0 |
| 0.9291666666666667 | 0 |
| 0.9298611111111111 | 0 |
| 0.9305555555555555 | 0 |
| 0.93125 | 0 |
| 0.9319444444444445 | 0 |
| 0.9326388888888889 | 0 |
| 0.9333333333333332 | 0 |
| 0.9340277777777778 | 0 |
| 0.9347222222222222 | 0 |
| 0.9354166666666667 | 0 |
| 0.936111111111111 | 0 |
| 0.9368055555555556 | 0 |
| 0.9375 | 0 |
| 0.9381944444444444 | 0 |
| 0.938888888888889 | 0 |
| 0.9395833333333333 | 0 |
| 0.9402777777777778 | 0 |
| 0.9409722222222222 | 0 |
| 0.9416666666666668 | 0 |
| 0.9423611111111111 | 0 |
| 0.9430555555555555 | 0 |
| 0.94375 | 0 |
| 0.9444444444444445 | 0 |
| 0.9451388888888889 | 0 |
| 0.9458333333333333 | 0 |
| 0.9465277777777777 | 0 |
| 0.9472222222222223 | 0 |
| 0.9479166666666666 | 0 |
| 0.9486111111111111 | 0 |
| 0.9493055555555556 | 0 |
| 0.9500000000000001 | 0 |
| 0.9506944444444444 | 0 |
| 0.9513888888888888 | 0 |
| 0.9520833333333334 | 0 |
| 0.9527777777777778 | 0 |
| 0.9534722222222222 | 0 |
| 0.9541666666666666 | 0 |
| 0.9548611111111112 | 0 |
| 0.9555555555555556 | 0 |
| 0.9562499999999999 | 0 |
| 0.9569444444444444 | 0 |
| 0.9576388888888889 | 0 |
| 0.9583333333333334 | 0 |
| 0.9590277777777777 | 0 |
| 0.9597222222222223 | 0 |
| 0.9604166666666667 | 0 |
| 0.9611111111111111 | 0 |
| 0.9618055555555555 | 0 |
| 0.9625 | 0 |
| 0.9631944444444445 | 0 |
| 0.9638888888888889 | 0 |
| 0.9645833333333332 | 0 |
| 0.9652777777777778 | 0 |
| 0.9659722222222222 | 0 |
| 0.9666666666666667 | 0 |
| 0.967361111111111 | 0 |
| 0.9680555555555556 | 0 |
| 0.96875 | 0 |
| 0.9694444444444444 | 0 |
| 0.970138888888889 | 0 |
| 0.9708333333333333 | 0 |
| 0.9715277777777778 | 0 |
| 0.9722222222222222 | 0 |
| 0.9729166666666668 | 0 |
| 0.9736111111111111 | 0 |
| 0.9743055555555555 | 0 |
| 0.975 | 0 |
| 0.9756944444444445 | 0 |
| 0.9763888888888889 | 0 |
| 0.9770833333333333 | 0 |
| 0.9777777777777777 | 0 |
| 0.9784722222222223 | 0 |
| 0.9791666666666666 | 0 |
| 0.9798611111111111 | 0 |
| 0.9805555555555556 | 0 |
| 0.9812500000000001 | 0 |
| 0.9819444444444444 | 0 |
| 0.9826388888888888 | 0 |
| 0.9833333333333334 | 0 |
| 0.9840277777777778 | 0 |
| 0.9847222222222222 | 0 |
| 0.9854166666666666 | 0 |
| 0.9861111111111112 | 0 |
| 0.9868055555555556 | 0 |
| 0.9874999999999999 | 0 |
| 0.9881944444444444 | 0 |
| 0.9888888888888889 | 0 |
| 0.9895833333333334 | 0 |
| 0.9902777777777777 | 0 |
| 0.9909722222222223 | 0 |
| 0.9916666666666667 | 0 |
| 0.9923611111111111 | 0 |
| 0.9930555555555555 | 0 |
| 0.99375 | 0 |
| 0.9944444444444445 | 0 |
| 0.9951388888888889 | 0 |
| 0.9958333333333332 | 0 |
| 0.9965277777777778 | 0 |
| 0.9972222222222222 | 0 |
| 0.9979166666666667 | 0 |
| 0.998611111111111 | 0 |
| 0.9993055555555556 | 0 |